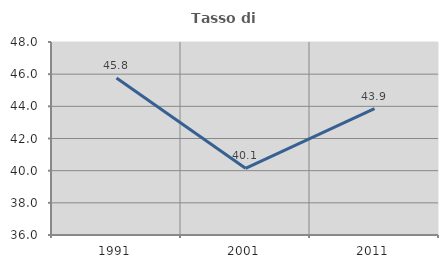
| Category | Tasso di occupazione   |
|---|---|
| 1991.0 | 45.764 |
| 2001.0 | 40.144 |
| 2011.0 | 43.857 |